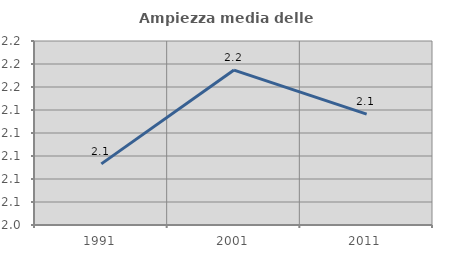
| Category | Ampiezza media delle famiglie |
|---|---|
| 1991.0 | 2.093 |
| 2001.0 | 2.175 |
| 2011.0 | 2.136 |